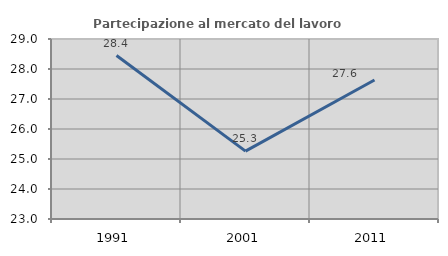
| Category | Partecipazione al mercato del lavoro  femminile |
|---|---|
| 1991.0 | 28.448 |
| 2001.0 | 25.263 |
| 2011.0 | 27.632 |